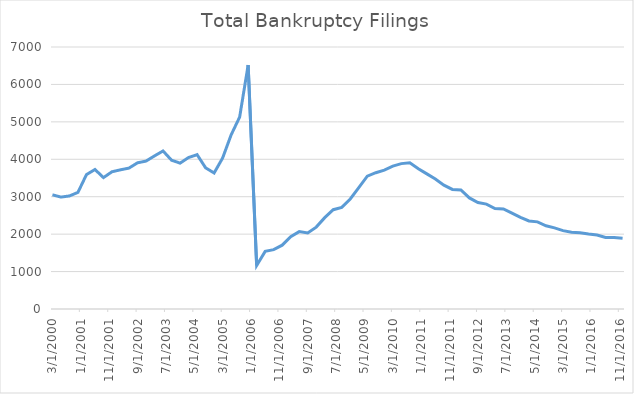
| Category | Total Bankruptcy Filings |
|---|---|
| 3/1/00 | 3051.063 |
| 6/1/00 | 2989.888 |
| 9/1/00 | 3020.612 |
| 12/1/00 | 3115.701 |
| 3/1/01 | 3590.536 |
| 6/1/01 | 3727.361 |
| 9/1/01 | 3510.745 |
| 12/1/01 | 3666.865 |
| 3/1/02 | 3718.664 |
| 6/1/02 | 3764.972 |
| 9/1/02 | 3905.962 |
| 12/1/02 | 3952.037 |
| 3/1/03 | 4090.858 |
| 6/1/03 | 4222.461 |
| 9/1/03 | 3975.499 |
| 12/1/03 | 3897.449 |
| 3/1/04 | 4046.954 |
| 6/1/04 | 4124.159 |
| 9/1/04 | 3772.051 |
| 12/1/04 | 3633.787 |
| 3/1/05 | 4033.415 |
| 6/1/05 | 4651.343 |
| 9/1/05 | 5127.123 |
| 12/1/05 | 6518.099 |
| 3/1/06 | 1163.341 |
| 6/1/06 | 1540.246 |
| 9/1/06 | 1586.581 |
| 12/1/06 | 1705.387 |
| 3/1/07 | 1934.936 |
| 6/1/07 | 2066.761 |
| 9/1/07 | 2029.768 |
| 12/1/07 | 2187.912 |
| 3/1/08 | 2441.086 |
| 6/1/08 | 2653.388 |
| 9/1/08 | 2715.374 |
| 12/1/08 | 2940.313 |
| 3/1/09 | 3241.107 |
| 6/1/09 | 3548.492 |
| 9/1/09 | 3641.398 |
| 12/1/09 | 3710.329 |
| 3/1/10 | 3816.139 |
| 6/1/10 | 3884.6 |
| 9/1/10 | 3908.762 |
| 12/1/10 | 3748.284 |
| 3/1/11 | 3611.057 |
| 6/1/11 | 3474.21 |
| 9/1/11 | 3309.686 |
| 12/1/11 | 3194.877 |
| 3/1/12 | 3181.518 |
| 6/1/12 | 2968.262 |
| 9/1/12 | 2844.035 |
| 12/1/12 | 2802.304 |
| 3/1/13 | 2683.839 |
| 6/1/13 | 2672.659 |
| 9/1/13 | 2561.089 |
| 12/1/13 | 2446.658 |
| 3/1/14 | 2351.931 |
| 6/1/14 | 2327.944 |
| 9/1/14 | 2223.889 |
| 12/1/14 | 2168.296 |
| 3/1/15 | 2094.738 |
| 6/1/15 | 2048.758 |
| 9/1/15 | 2037.122 |
| 12/1/15 | 2003.699 |
| 3/1/16 | 1976.591 |
| 6/1/16 | 1912.245 |
| 9/1/16 | 1911.497 |
| 12/1/16 | 1890.554 |